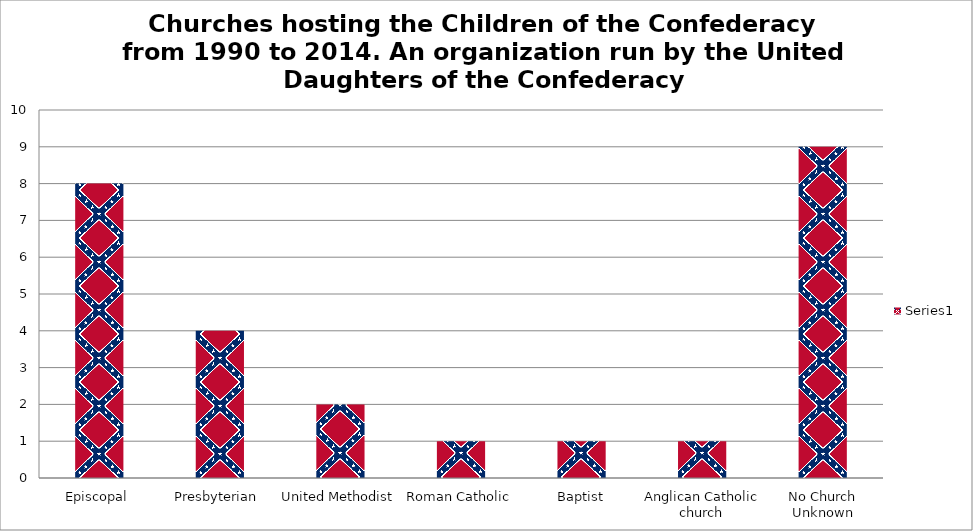
| Category | Series 0 |
|---|---|
| Episcopal | 8 |
| Presbyterian  | 4 |
| United Methodist | 2 |
| Roman Catholic | 1 |
| Baptist | 1 |
| Anglican Catholic church | 1 |
| No Church Unknown | 9 |